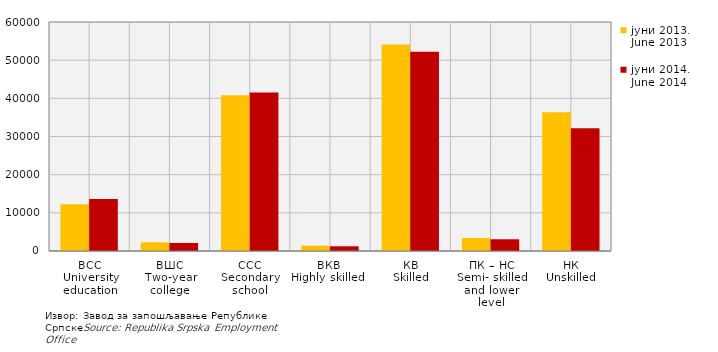
| Category | јуни 2013.
June 2013 | јуни 2014.
June 2014 |
|---|---|---|
| ВСС
University education | 12271 | 13656 |
| ВШС
Two-year college | 2261 | 2096 |
| ССС
Secondary school | 40818 | 41534 |
| ВКВ 
Highly skilled    | 1393 | 1227 |
| КВ
Skilled | 54110 | 52180 |
| ПК – НС
Semi- skilled and lower level | 3404 | 3076 |
| НК
Unskilled | 36344 | 32169 |